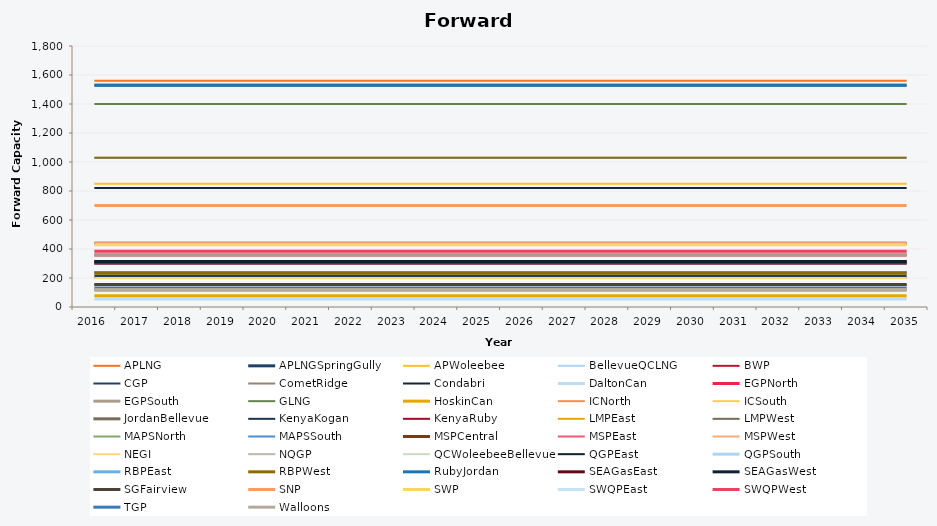
| Category | APLNG | APLNGSpringGully | APWoleebee | BellevueQCLNG | BWP | CGP | CometRidge | Condabri | DaltonCan | EGPNorth | EGPSouth | GLNG | HoskinCan | ICNorth | ICSouth | JordanBellevue | KenyaKogan | KenyaRuby | LMPEast | LMPWest | MAPSNorth | MAPSSouth | MSPCentral | MSPEast | MSPWest | NEGI | NQGP | QCWoleebeeBellevue | QGPEast | QGPSouth | RBPEast | RBPWest | RubyJordan | SEAGasEast | SEAGasWest | SGFairview | SNP | SWP | SWQPEast | SWQPWest | TGP | Walloons |
|---|---|---|---|---|---|---|---|---|---|---|---|---|---|---|---|---|---|---|---|---|---|---|---|---|---|---|---|---|---|---|---|---|---|---|---|---|---|---|---|---|---|---|
| 2016.0 | 1560 | 210 | 850 | 1530 | 150 | 119 | 200 | 820 | 56 | 358 | 358 | 1400 | 77 | 120 | 120 | 1530 | 300 | 300 | 1030 | 1030 | 241 | 241 | 439 | 439 | 439 | 200 | 110 | 1530 | 151 | 151 | 233 | 233 | 1530 | 314 | 314 | 155 | 700 | 429 | 384 | 384 | 130 | 120 |
| 2017.0 | 1560 | 210 | 850 | 1530 | 150 | 119 | 200 | 820 | 56 | 358 | 358 | 1400 | 77 | 120 | 120 | 1530 | 300 | 300 | 1030 | 1030 | 241 | 241 | 439 | 439 | 439 | 200 | 110 | 1530 | 151 | 151 | 233 | 233 | 1530 | 314 | 314 | 155 | 700 | 429 | 384 | 384 | 130 | 120 |
| 2018.0 | 1560 | 210 | 850 | 1530 | 150 | 119 | 200 | 820 | 56 | 358 | 358 | 1400 | 77 | 120 | 120 | 1530 | 300 | 300 | 1030 | 1030 | 241 | 241 | 439 | 439 | 439 | 200 | 110 | 1530 | 151 | 151 | 233 | 233 | 1530 | 314 | 314 | 155 | 700 | 429 | 384 | 384 | 130 | 120 |
| 2019.0 | 1560 | 210 | 850 | 1530 | 150 | 119 | 200 | 820 | 56 | 358 | 358 | 1400 | 77 | 120 | 120 | 1530 | 300 | 300 | 1030 | 1030 | 241 | 241 | 439 | 439 | 439 | 200 | 110 | 1530 | 151 | 151 | 233 | 233 | 1530 | 314 | 314 | 155 | 700 | 429 | 384 | 384 | 130 | 120 |
| 2020.0 | 1560 | 210 | 850 | 1530 | 150 | 119 | 200 | 820 | 56 | 358 | 358 | 1400 | 77 | 120 | 120 | 1530 | 300 | 300 | 1030 | 1030 | 241 | 241 | 439 | 439 | 439 | 200 | 110 | 1530 | 151 | 151 | 233 | 233 | 1530 | 314 | 314 | 155 | 700 | 429 | 384 | 384 | 130 | 120 |
| 2021.0 | 1560 | 210 | 850 | 1530 | 150 | 119 | 200 | 820 | 56 | 358 | 358 | 1400 | 77 | 120 | 120 | 1530 | 300 | 300 | 1030 | 1030 | 241 | 241 | 439 | 439 | 439 | 200 | 110 | 1530 | 151 | 151 | 233 | 233 | 1530 | 314 | 314 | 155 | 700 | 429 | 384 | 384 | 130 | 120 |
| 2022.0 | 1560 | 210 | 850 | 1530 | 150 | 119 | 200 | 820 | 56 | 358 | 358 | 1400 | 77 | 120 | 120 | 1530 | 300 | 300 | 1030 | 1030 | 241 | 241 | 439 | 439 | 439 | 200 | 110 | 1530 | 151 | 151 | 233 | 233 | 1530 | 314 | 314 | 155 | 700 | 429 | 384 | 384 | 130 | 120 |
| 2023.0 | 1560 | 210 | 850 | 1530 | 150 | 119 | 200 | 820 | 56 | 358 | 358 | 1400 | 77 | 120 | 120 | 1530 | 300 | 300 | 1030 | 1030 | 241 | 241 | 439 | 439 | 439 | 200 | 110 | 1530 | 151 | 151 | 233 | 233 | 1530 | 314 | 314 | 155 | 700 | 429 | 384 | 384 | 130 | 120 |
| 2024.0 | 1560 | 210 | 850 | 1530 | 150 | 119 | 200 | 820 | 56 | 358 | 358 | 1400 | 77 | 120 | 120 | 1530 | 300 | 300 | 1030 | 1030 | 241 | 241 | 439 | 439 | 439 | 200 | 110 | 1530 | 151 | 151 | 233 | 233 | 1530 | 314 | 314 | 155 | 700 | 429 | 384 | 384 | 130 | 120 |
| 2025.0 | 1560 | 210 | 850 | 1530 | 150 | 119 | 200 | 820 | 56 | 358 | 358 | 1400 | 77 | 120 | 120 | 1530 | 300 | 300 | 1030 | 1030 | 241 | 241 | 439 | 439 | 439 | 200 | 110 | 1530 | 151 | 151 | 233 | 233 | 1530 | 314 | 314 | 155 | 700 | 429 | 384 | 384 | 130 | 120 |
| 2026.0 | 1560 | 210 | 850 | 1530 | 150 | 119 | 200 | 820 | 56 | 358 | 358 | 1400 | 77 | 120 | 120 | 1530 | 300 | 300 | 1030 | 1030 | 241 | 241 | 439 | 439 | 439 | 200 | 110 | 1530 | 151 | 151 | 233 | 233 | 1530 | 314 | 314 | 155 | 700 | 429 | 384 | 384 | 130 | 120 |
| 2027.0 | 1560 | 210 | 850 | 1530 | 150 | 119 | 200 | 820 | 56 | 358 | 358 | 1400 | 77 | 120 | 120 | 1530 | 300 | 300 | 1030 | 1030 | 241 | 241 | 439 | 439 | 439 | 200 | 110 | 1530 | 151 | 151 | 233 | 233 | 1530 | 314 | 314 | 155 | 700 | 429 | 384 | 384 | 130 | 120 |
| 2028.0 | 1560 | 210 | 850 | 1530 | 150 | 119 | 200 | 820 | 56 | 358 | 358 | 1400 | 77 | 120 | 120 | 1530 | 300 | 300 | 1030 | 1030 | 241 | 241 | 439 | 439 | 439 | 200 | 110 | 1530 | 151 | 151 | 233 | 233 | 1530 | 314 | 314 | 155 | 700 | 429 | 384 | 384 | 130 | 120 |
| 2029.0 | 1560 | 210 | 850 | 1530 | 150 | 119 | 200 | 820 | 56 | 358 | 358 | 1400 | 77 | 120 | 120 | 1530 | 300 | 300 | 1030 | 1030 | 241 | 241 | 439 | 439 | 439 | 200 | 110 | 1530 | 151 | 151 | 233 | 233 | 1530 | 314 | 314 | 155 | 700 | 429 | 384 | 384 | 130 | 120 |
| 2030.0 | 1560 | 210 | 850 | 1530 | 150 | 119 | 200 | 820 | 56 | 358 | 358 | 1400 | 77 | 120 | 120 | 1530 | 300 | 300 | 1030 | 1030 | 241 | 241 | 439 | 439 | 439 | 200 | 110 | 1530 | 151 | 151 | 233 | 233 | 1530 | 314 | 314 | 155 | 700 | 429 | 384 | 384 | 130 | 120 |
| 2031.0 | 1560 | 210 | 850 | 1530 | 150 | 119 | 200 | 820 | 56 | 358 | 358 | 1400 | 77 | 120 | 120 | 1530 | 300 | 300 | 1030 | 1030 | 241 | 241 | 439 | 439 | 439 | 200 | 110 | 1530 | 151 | 151 | 233 | 233 | 1530 | 314 | 314 | 155 | 700 | 429 | 384 | 384 | 130 | 120 |
| 2032.0 | 1560 | 210 | 850 | 1530 | 150 | 119 | 200 | 820 | 56 | 358 | 358 | 1400 | 77 | 120 | 120 | 1530 | 300 | 300 | 1030 | 1030 | 241 | 241 | 439 | 439 | 439 | 200 | 110 | 1530 | 151 | 151 | 233 | 233 | 1530 | 314 | 314 | 155 | 700 | 429 | 384 | 384 | 130 | 120 |
| 2033.0 | 1560 | 210 | 850 | 1530 | 150 | 119 | 200 | 820 | 56 | 358 | 358 | 1400 | 77 | 120 | 120 | 1530 | 300 | 300 | 1030 | 1030 | 241 | 241 | 439 | 439 | 439 | 200 | 110 | 1530 | 151 | 151 | 233 | 233 | 1530 | 314 | 314 | 155 | 700 | 429 | 384 | 384 | 130 | 120 |
| 2034.0 | 1560 | 210 | 850 | 1530 | 150 | 119 | 200 | 820 | 56 | 358 | 358 | 1400 | 77 | 120 | 120 | 1530 | 300 | 300 | 1030 | 1030 | 241 | 241 | 439 | 439 | 439 | 200 | 110 | 1530 | 151 | 151 | 233 | 233 | 1530 | 314 | 314 | 155 | 700 | 429 | 384 | 384 | 130 | 120 |
| 2035.0 | 1560 | 210 | 850 | 1530 | 150 | 119 | 200 | 820 | 56 | 358 | 358 | 1400 | 77 | 120 | 120 | 1530 | 300 | 300 | 1030 | 1030 | 241 | 241 | 439 | 439 | 439 | 200 | 110 | 1530 | 151 | 151 | 233 | 233 | 1530 | 314 | 314 | 155 | 700 | 429 | 384 | 384 | 130 | 120 |